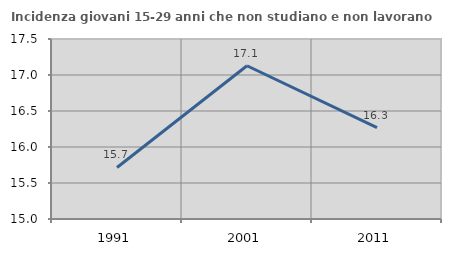
| Category | Incidenza giovani 15-29 anni che non studiano e non lavorano  |
|---|---|
| 1991.0 | 15.715 |
| 2001.0 | 17.128 |
| 2011.0 | 16.268 |